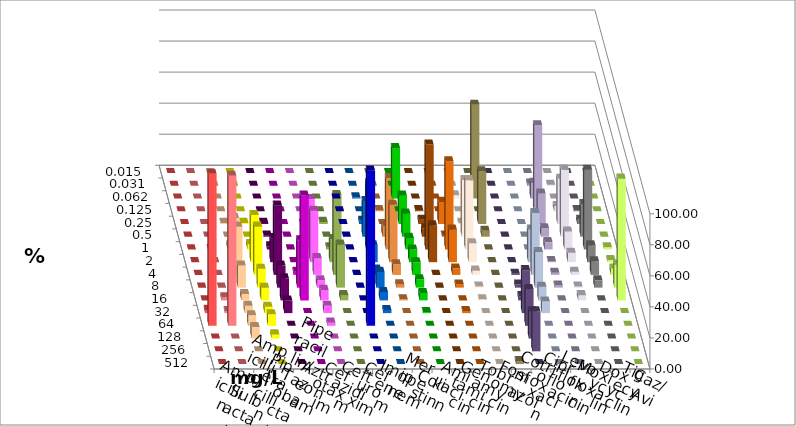
| Category | Ampicillin | Ampicillin/ Sulbactam | Piperacillin | Piperacillin/ Tazobactam | Aztreonam | Cefotaxim | Ceftazidim | Cefuroxim | Imipenem | Meropenem | Colistin | Amikacin | Gentamicin | Tobramycin | Fosfomycin | Cotrimoxazol | Ciprofloxacin | Levofloxacin | Moxifloxacin | Doxycyclin | Tigecyclin | Caz/Avi |
|---|---|---|---|---|---|---|---|---|---|---|---|---|---|---|---|---|---|---|---|---|---|---|
| 0.015 | 0 | 0 | 0 | 0 | 0 | 0 | 0 | 0 | 0 | 0 | 0 | 0 | 0 | 0 | 0 | 0 | 0 | 0 | 0 | 0 | 0 | 0 |
| 0.031 | 0 | 0 | 0 | 0 | 0 | 0 | 0 | 0 | 0 | 0 | 0 | 0 | 0 | 0 | 0 | 0 | 1.351 | 0.676 | 0 | 0 | 0 | 0 |
| 0.062 | 0 | 0 | 0 | 0 | 0 | 0 | 0 | 0 | 0.676 | 32.432 | 0 | 0 | 2.027 | 60.377 | 0 | 0 | 10.135 | 0 | 0 | 0 | 0 | 0 |
| 0.125 | 0 | 0 | 0 | 0 | 0 | 0 | 0 | 0 | 0 | 0 | 0.676 | 0 | 0 | 0 | 0 | 0 | 55.405 | 3.378 | 0.676 | 0 | 0 | 0.685 |
| 0.25 | 0 | 0 | 0.676 | 0.676 | 0.676 | 0 | 0 | 0 | 2.027 | 18.243 | 2.703 | 14.189 | 0.676 | 33.962 | 0 | 0 | 19.595 | 29.054 | 2.703 | 0 | 1.351 | 0 |
| 0.5 | 0 | 0 | 0 | 0 | 0.676 | 0 | 5.405 | 0 | 22.973 | 14.865 | 5.405 | 0.676 | 36.486 | 3.774 | 0 | 0 | 5.405 | 43.243 | 20.946 | 0 | 0 | 6.849 |
| 1.0 | 0 | 0 | 2.703 | 3.378 | 2.027 | 0 | 32.432 | 0 | 42.568 | 7.432 | 67.568 | 56.757 | 44.595 | 0 | 0 | 0 | 4.73 | 11.486 | 51.351 | 1.351 | 1.351 | 45.89 |
| 2.0 | 0 | 0 | 28.378 | 30.405 | 15.541 | 0 | 33.108 | 0 | 10.811 | 8.108 | 23.649 | 20.946 | 12.162 | 0 | 0 | 20.946 | 0.676 | 6.081 | 10.811 | 1.351 | 14.865 | 36.986 |
| 4.0 | 0 | 0 | 31.081 | 31.081 | 44.595 | 2.027 | 10.811 | 0 | 3.378 | 8.108 | 0 | 4.054 | 2.703 | 0 | 0.676 | 39.865 | 1.351 | 2.027 | 8.784 | 4.054 | 51.351 | 6.849 |
| 8.0 | 0 | 0 | 14.189 | 12.162 | 14.189 | 30.405 | 4.73 | 0 | 10.135 | 5.405 | 0 | 2.027 | 0.676 | 0 | 2.027 | 22.973 | 1.351 | 0.676 | 4.73 | 14.865 | 27.703 | 2.055 |
| 16.0 | 0 | 2.027 | 4.054 | 8.108 | 14.189 | 67.568 | 6.757 | 0 | 5.405 | 4.73 | 0 | 0 | 0.676 | 0 | 2.703 | 8.784 | 0 | 3.378 | 0 | 78.378 | 3.378 | 0.685 |
| 32.0 | 2.041 | 1.351 | 4.73 | 4.054 | 8.108 | 0 | 4.73 | 0 | 2.027 | 0.676 | 0 | 1.351 | 0 | 0 | 27.703 | 7.432 | 0 | 0 | 0 | 0 | 0 | 0 |
| 64.0 | 97.959 | 96.622 | 6.757 | 7.432 | 0 | 0 | 2.027 | 100 | 0 | 0 | 0 | 0 | 0 | 0 | 23.649 | 0 | 0 | 0 | 0 | 0 | 0 | 0 |
| 128.0 | 0 | 0 | 7.432 | 2.703 | 0 | 0 | 0 | 0 | 0 | 0 | 0 | 0 | 0 | 0 | 17.568 | 0 | 0 | 0 | 0 | 0 | 0 | 0 |
| 256.0 | 0 | 0 | 0 | 0 | 0 | 0 | 0 | 0 | 0 | 0 | 0 | 0 | 0 | 0 | 25.676 | 0 | 0 | 0 | 0 | 0 | 0 | 0 |
| 512.0 | 0 | 0 | 0 | 0 | 0 | 0 | 0 | 0 | 0 | 0 | 0 | 0 | 0 | 1.887 | 0 | 0 | 0 | 0 | 0 | 0 | 0 | 0 |